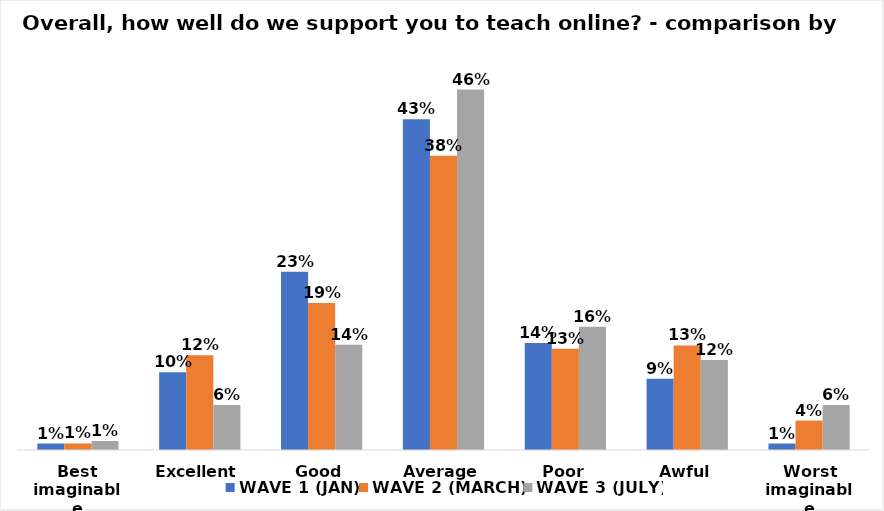
| Category | WAVE 1 (JAN) | WAVE 2 (MARCH) | WAVE 3 (JULY) |
|---|---|---|---|
| Best imaginable | 0.008 | 0.008 | 0.012 |
| Excellent | 0.1 | 0.122 | 0.058 |
| Good | 0.229 | 0.189 | 0.135 |
| Average | 0.425 | 0.378 | 0.463 |
| Poor | 0.138 | 0.13 | 0.158 |
| Awful | 0.092 | 0.134 | 0.116 |
| Worst imaginable | 0.008 | 0.038 | 0.058 |